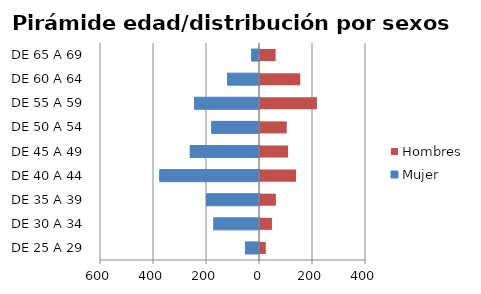
| Category | Mujer | Hombres |
|---|---|---|
| DE 25 A 29 | -53 | 22 |
| DE 30 A 34 | -172 | 45 |
| DE 35 A 39 | -200 | 60 |
| DE 40 A 44 | -376 | 136 |
| DE 45 A 49 | -261 | 106 |
| DE 50 A 54 | -180 | 101 |
| DE 55 A 59 | -245 | 215 |
| DE 60 A 64 | -120 | 152 |
| DE 65 A 69 | -29 | 59 |